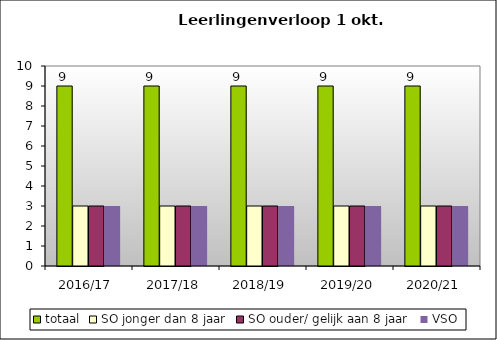
| Category | totaal | SO jonger dan 8 jaar | SO ouder/ gelijk aan 8 jaar | VSO |
|---|---|---|---|---|
| 2016/17 | 9 | 3 | 3 | 3 |
| 2017/18 | 9 | 3 | 3 | 3 |
| 2018/19 | 9 | 3 | 3 | 3 |
| 2019/20 | 9 | 3 | 3 | 3 |
| 2020/21 | 9 | 3 | 3 | 3 |